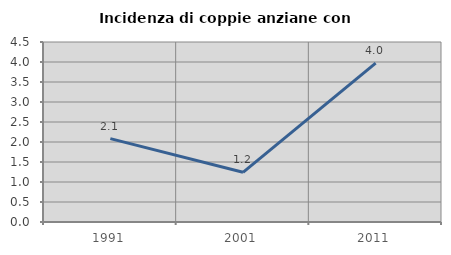
| Category | Incidenza di coppie anziane con figli |
|---|---|
| 1991.0 | 2.083 |
| 2001.0 | 1.242 |
| 2011.0 | 3.974 |